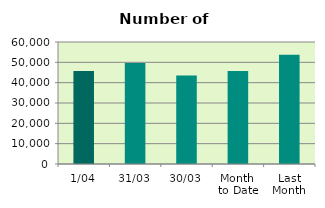
| Category | Series 0 |
|---|---|
| 1/04 | 45736 |
| 31/03 | 49634 |
| 30/03 | 43480 |
| Month 
to Date | 45736 |
| Last
Month | 53669.217 |